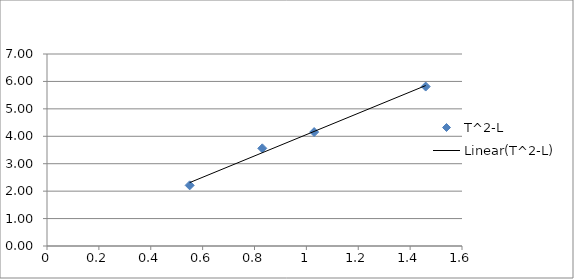
| Category | T^2-L |
|---|---|
| 0.55 | 2.211 |
| 0.83 | 3.561 |
| 1.03 | 4.153 |
| 1.46 | 5.813 |